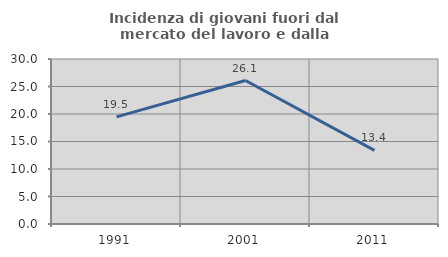
| Category | Incidenza di giovani fuori dal mercato del lavoro e dalla formazione  |
|---|---|
| 1991.0 | 19.481 |
| 2001.0 | 26.087 |
| 2011.0 | 13.38 |